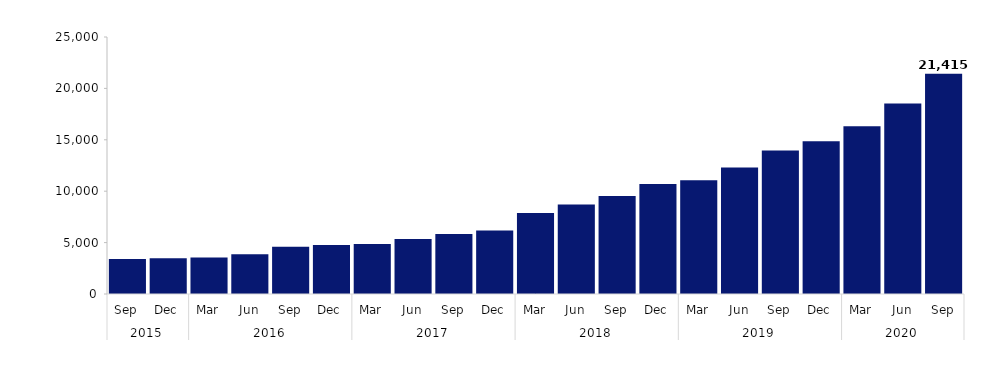
| Category | Series 0 |
|---|---|
| 0 | 3399 |
| 1 | 3476 |
| 2 | 3549 |
| 3 | 3877 |
| 4 | 4602 |
| 5 | 4771 |
| 6 | 4865 |
| 7 | 5353 |
| 8 | 5844 |
| 9 | 6182 |
| 10 | 7890 |
| 11 | 8704 |
| 12 | 9536 |
| 13 | 10712 |
| 14 | 11067 |
| 15 | 12311 |
| 16 | 13966 |
| 17 | 14869 |
| 18 | 16309 |
| 19 | 18520 |
| 20 | 21415 |